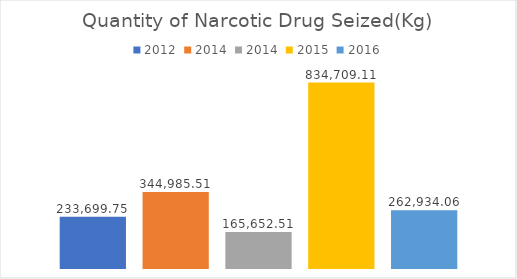
| Category | 2012 | 2014 | 2015 | 2016 |
|---|---|---|---|---|
| 0 | 233699.749 | 165652.506 | 834709.11 | 262934.06 |